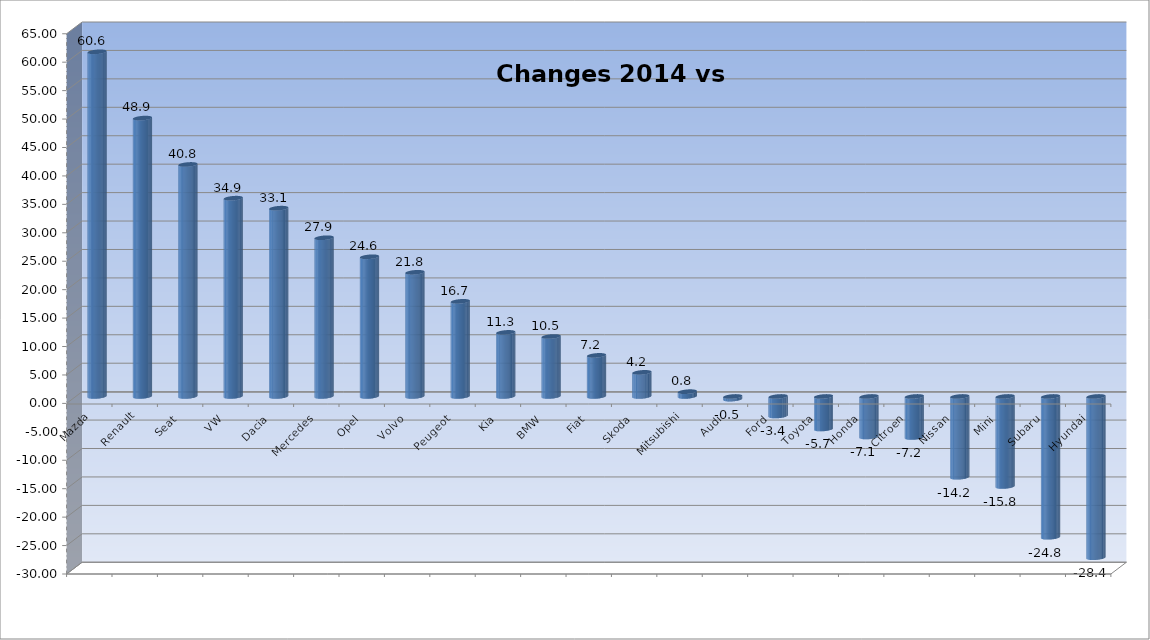
| Category | Ytd 2015 |
|---|---|
| Mazda | 60.606 |
| Renault | 48.949 |
| Seat | 40.798 |
| VW | 34.865 |
| Dacia | 33.108 |
| Mercedes | 27.909 |
| Opel | 24.564 |
| Volvo | 21.831 |
| Peugeot | 16.728 |
| Kia | 11.265 |
| BMW | 10.544 |
| Fiat | 7.225 |
| Skoda | 4.239 |
| Mitsubishi | 0.845 |
| Audi | -0.471 |
| Ford | -3.433 |
| Toyota | -5.721 |
| Honda | -7.119 |
| Citroen | -7.214 |
| Nissan | -14.205 |
| Mini | -15.83 |
| Subaru | -24.758 |
| Hyundai | -28.351 |